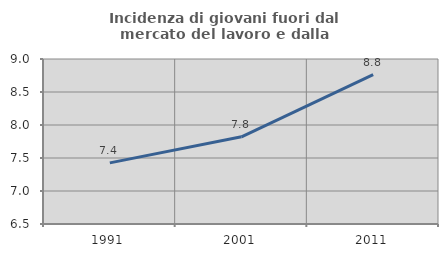
| Category | Incidenza di giovani fuori dal mercato del lavoro e dalla formazione  |
|---|---|
| 1991.0 | 7.426 |
| 2001.0 | 7.821 |
| 2011.0 | 8.763 |